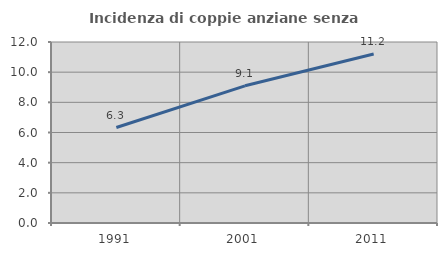
| Category | Incidenza di coppie anziane senza figli  |
|---|---|
| 1991.0 | 6.329 |
| 2001.0 | 9.096 |
| 2011.0 | 11.201 |